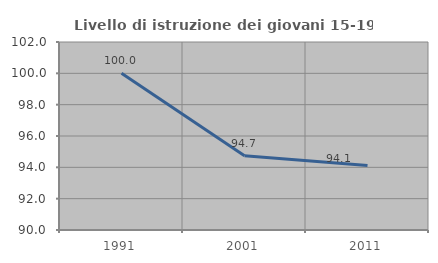
| Category | Livello di istruzione dei giovani 15-19 anni |
|---|---|
| 1991.0 | 100 |
| 2001.0 | 94.737 |
| 2011.0 | 94.118 |